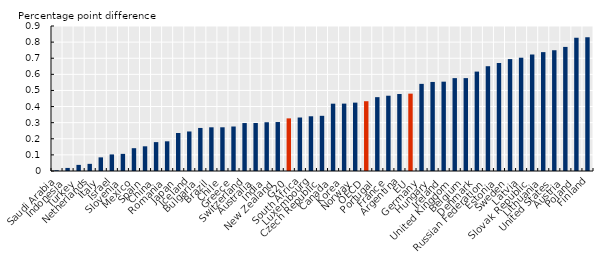
| Category | Harmful alcohol |
|---|---|
| Saudi Arabia | 0.005 |
| Indonesia | 0.019 |
| Turkey | 0.038 |
| Netherlands | 0.044 |
| Italy | 0.085 |
| Israel | 0.103 |
| Slovenia | 0.106 |
| Mexico | 0.142 |
| Spain | 0.153 |
| China | 0.179 |
| Romania | 0.184 |
| Japan | 0.236 |
| Iceland | 0.245 |
| Bulgaria | 0.267 |
| Brazil | 0.271 |
| Chile | 0.271 |
| Greece | 0.276 |
| Switzerland | 0.298 |
| Australia | 0.298 |
| India | 0.303 |
| New Zealand | 0.304 |
| G20 | 0.327 |
| South Africa | 0.332 |
| Luxembourg | 0.34 |
| Czech Republic | 0.342 |
| Canada | 0.418 |
| Korea | 0.418 |
| Norway | 0.424 |
| OECD | 0.433 |
| Portugal | 0.458 |
| France | 0.467 |
| Argentina | 0.478 |
| EU | 0.48 |
| Germany | 0.541 |
| Hungary | 0.553 |
| Ireland | 0.554 |
| United Kingdom | 0.576 |
| Belgium | 0.577 |
| Denmark | 0.617 |
| Russian Federation | 0.65 |
| Estonia | 0.67 |
| Sweden | 0.695 |
| Latvia | 0.703 |
| Slovak Republic | 0.723 |
| Lithuania | 0.738 |
| United States | 0.75 |
| Austria | 0.77 |
| Poland | 0.827 |
| Finland | 0.83 |